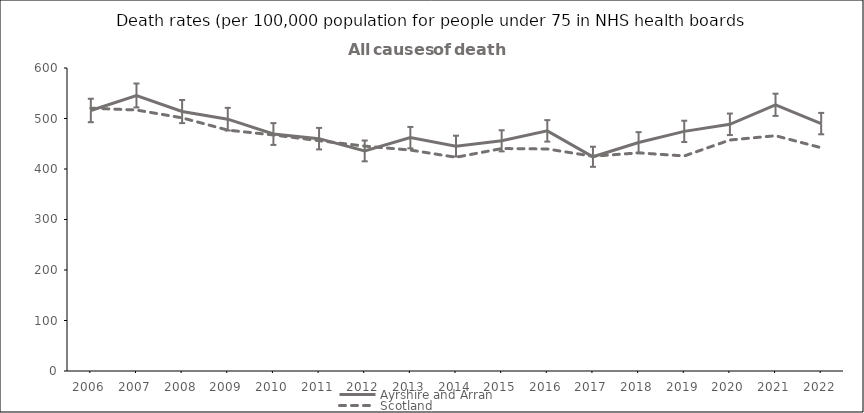
| Category | Ayrshire and Arran | Scotland |
|---|---|---|
| 2006.0 | 515.9 | 520.4 |
| 2007.0 | 545.6 | 516.8 |
| 2008.0 | 513.8 | 501.3 |
| 2009.0 | 498.7 | 477 |
| 2010.0 | 469.3 | 467.4 |
| 2011.0 | 460.1 | 456.1 |
| 2012.0 | 435.8 | 445.3 |
| 2013.0 | 462.1 | 437.5 |
| 2014.0 | 445.3 | 423.2 |
| 2015.0 | 455.8 | 440.5 |
| 2016.0 | 475.5 | 439.7 |
| 2017.0 | 424.2 | 425.2 |
| 2018.0 | 452.5 | 432 |
| 2019.0 | 474.5 | 425.8 |
| 2020.0 | 488.5 | 457.4 |
| 2021.0 | 527.1 | 465.9 |
| 2022.0 | 489.9 | 442.1 |